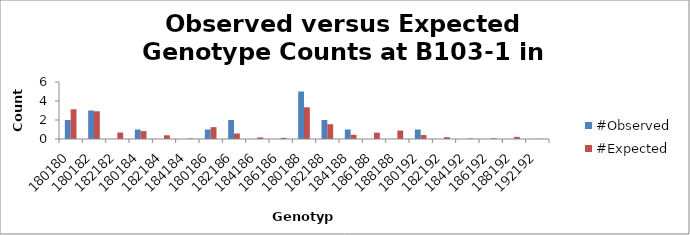
| Category | #Observed | #Expected |
|---|---|---|
| 180180.0 | 2 | 3.125 |
| 180182.0 | 3 | 2.917 |
| 182182.0 | 0 | 0.681 |
| 180184.0 | 1 | 0.833 |
| 182184.0 | 0 | 0.389 |
| 184184.0 | 0 | 0.056 |
| 180186.0 | 1 | 1.25 |
| 182186.0 | 2 | 0.583 |
| 184186.0 | 0 | 0.167 |
| 186186.0 | 0 | 0.125 |
| 180188.0 | 5 | 3.333 |
| 182188.0 | 2 | 1.556 |
| 184188.0 | 1 | 0.444 |
| 186188.0 | 0 | 0.667 |
| 188188.0 | 0 | 0.889 |
| 180192.0 | 1 | 0.417 |
| 182192.0 | 0 | 0.194 |
| 184192.0 | 0 | 0.056 |
| 186192.0 | 0 | 0.083 |
| 188192.0 | 0 | 0.222 |
| 192192.0 | 0 | 0.014 |